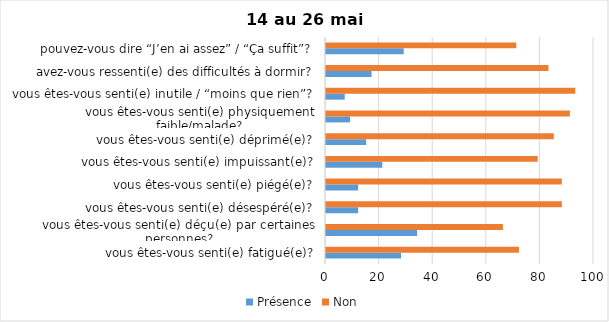
| Category | Présence | Non |
|---|---|---|
| vous êtes-vous senti(e) fatigué(e)? | 28 | 72 |
| vous êtes-vous senti(e) déçu(e) par certaines personnes? | 34 | 66 |
| vous êtes-vous senti(e) désespéré(e)? | 12 | 88 |
| vous êtes-vous senti(e) piégé(e)? | 12 | 88 |
| vous êtes-vous senti(e) impuissant(e)? | 21 | 79 |
| vous êtes-vous senti(e) déprimé(e)? | 15 | 85 |
| vous êtes-vous senti(e) physiquement faible/malade? | 9 | 91 |
| vous êtes-vous senti(e) inutile / “moins que rien”? | 7 | 93 |
| avez-vous ressenti(e) des difficultés à dormir? | 17 | 83 |
| pouvez-vous dire “J’en ai assez” / “Ça suffit”? | 29 | 71 |